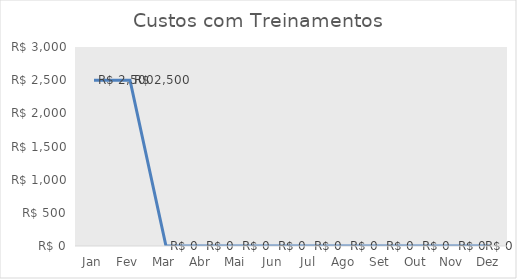
| Category | Custos com Treinamentos |
|---|---|
| Jan | 2500 |
| Fev | 2500 |
| Mar | 0 |
| Abr | 0 |
| Mai | 0 |
| Jun | 0 |
| Jul | 0 |
| Ago | 0 |
| Set | 0 |
| Out | 0 |
| Nov | 0 |
| Dez | 0 |